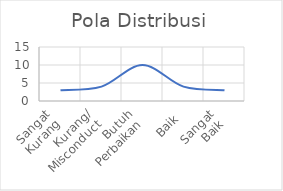
| Category | Pola Distribusi |
|---|---|
| Sangat
Kurang | 3 |
| Kurang/
Misconduct | 4 |
| Butuh
Perbaikan | 10 |
| Baik | 4 |
| Sangat
Baik | 3 |